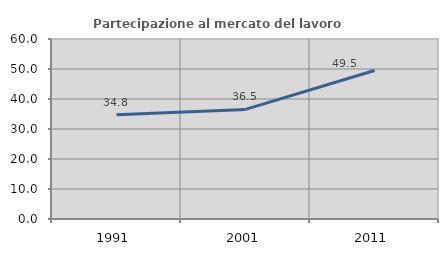
| Category | Partecipazione al mercato del lavoro  femminile |
|---|---|
| 1991.0 | 34.77 |
| 2001.0 | 36.524 |
| 2011.0 | 49.495 |